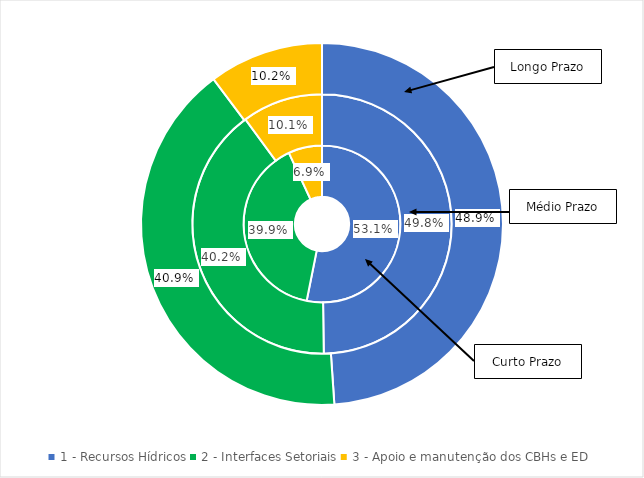
| Category | Curto Prazo (%) | Médio Prazo (%) | Longo Prazo (%) |
|---|---|---|---|
| 1 - Recursos Hídricos | 0.531 | 0.498 | 0.489 |
| 2 - Interfaces Setoriais | 0.399 | 0.402 | 0.409 |
| 3 - Apoio e manutenção dos CBHs e ED | 0.069 | 0.101 | 0.102 |